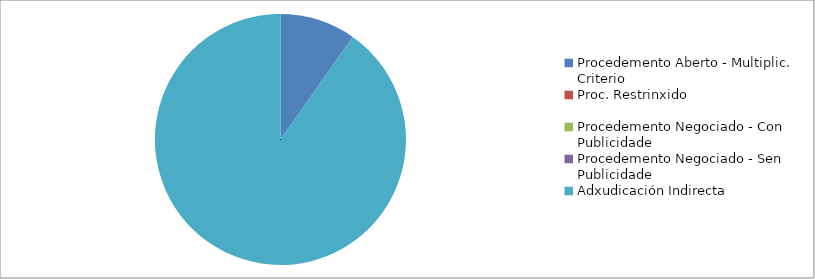
| Category | Series 0 | Series 1 |
|---|---|---|
| Procedemento Aberto - Multiplic. Criterio | 508092.74 | 0.098 |
| Proc. Restrinxido | 0 | 0 |
| Procedemento Negociado - Con Publicidade | 0 | 0 |
| Procedemento Negociado - Sen Publicidade | 0 | 0 |
| Adxudicación Indirecta | 4695797.41 | 0.902 |